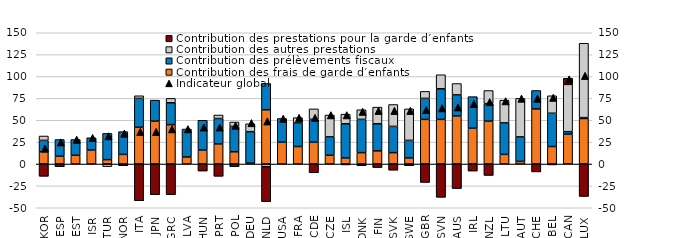
| Category | Contribution des frais de garde d’enfants | Contribution des prélèvements fiscaux | Contribution des autres prestations | Contribution des prestations pour la garde d’enfants |
|---|---|---|---|---|
| KOR | 14 | 13 | 5 | -14 |
| ESP | 9 | 19 | 0 | -3 |
| EST | 10 | 18 | 0 | 0 |
| ISR | 16 | 14 | 0 | 0 |
| TUR | 5 | 30 | -3 | 0 |
| NOR | 11 | 26 | 0 | -2 |
| ITA | 42 | 33 | 3 | -42 |
| JPN | 49 | 24 | 0 | -35 |
| GRC | 45 | 25 | 5 | -35 |
| LVA | 8 | 32 | 0 | 0 |
| HUN | 16 | 34 | 0 | -8 |
| PRT | 23 | 29 | 4 | -14 |
| POL | 14 | 29 | 5 | -3 |
| DEU | 1 | 36 | 9 | 0 |
| NLD | 62 | 30 | -3 | -40 |
| USA | 25 | 27 | 0 | 0 |
| FRA | 20 | 27 | 6 | 0 |
| OCDE | 25 | 26 | 12 | -10 |
| CZE | 10 | 21 | 25 | 0 |
| ISL | 7 | 39 | 11 | -1 |
| DNK | 13 | 38 | 11 | -2 |
| FIN | 15 | 31 | 19 | -4 |
| SVK | 13 | 30 | 25 | -7 |
| SWE | 7 | 20 | 36 | -2 |
| GBR | 51 | 24 | 8 | -21 |
| SVN | 51 | 35 | 16 | -38 |
| AUS | 55 | 24 | 13 | -28 |
| IRL | 41 | 36 | 0 | -8 |
| NZL | 49 | 20 | 15 | -13 |
| LTU | 11 | 36 | 26 | 0 |
| AUT | 3 | 28 | 44 | 0 |
| CHE | 63 | 21 | 0 | -9 |
| BEL | 20 | 38 | 20 | -1 |
| CAN | 34 | 3 | 54 | 7 |
| LUX | 52 | 1 | 85 | -37 |